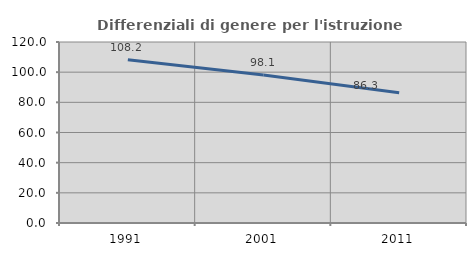
| Category | Differenziali di genere per l'istruzione superiore |
|---|---|
| 1991.0 | 108.183 |
| 2001.0 | 98.061 |
| 2011.0 | 86.287 |